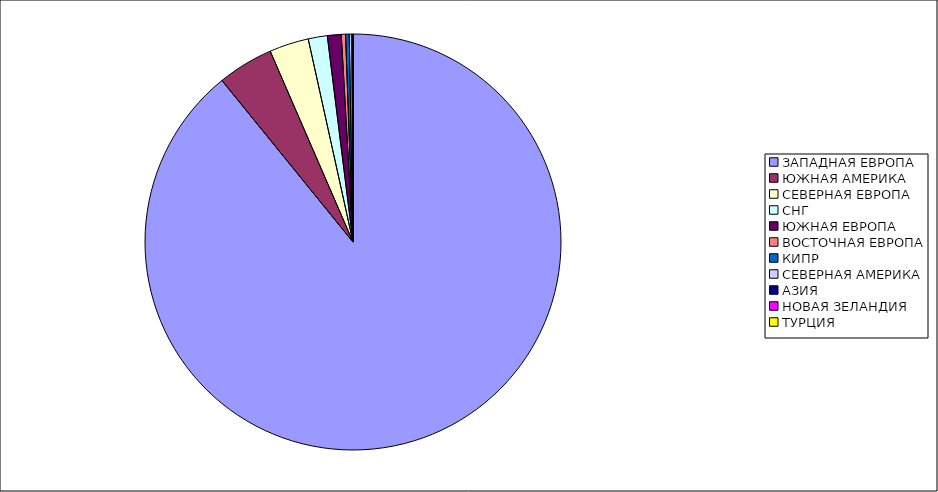
| Category | Оборот |
|---|---|
| ЗАПАДНАЯ ЕВРОПА | 0.891 |
| ЮЖНАЯ АМЕРИКА | 0.043 |
| СЕВЕРНАЯ ЕВРОПА | 0.031 |
| СНГ | 0.015 |
| ЮЖНАЯ ЕВРОПА | 0.011 |
| ВОСТОЧНАЯ ЕВРОПА | 0.003 |
| КИПР | 0.003 |
| СЕВЕРНАЯ АМЕРИКА | 0.002 |
| АЗИЯ | 0.001 |
| НОВАЯ ЗЕЛАНДИЯ | 0 |
| ТУРЦИЯ | 0 |